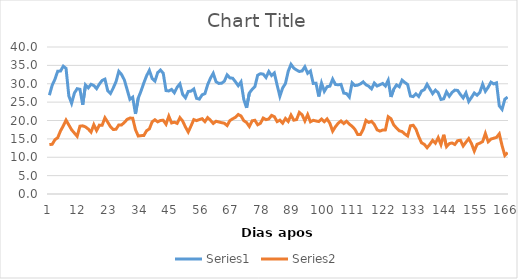
| Category | Series 0 | Series 1 |
|---|---|---|
| 0 | 26.88 | 13.46 |
| 1 | 29.59 | 13.52 |
| 2 | 31.21 | 14.77 |
| 3 | 33.43 | 15.32 |
| 4 | 33.44 | 17.16 |
| 5 | 34.78 | 18.52 |
| 6 | 34.18 | 20.11 |
| 7 | 26.69 | 18.78 |
| 8 | 24.68 | 17.48 |
| 9 | 27.46 | 16.58 |
| 10 | 28.66 | 15.7 |
| 11 | 28.49 | 18.45 |
| 12 | 24.28 | 18.55 |
| 13 | 29.68 | 18.26 |
| 14 | 28.88 | 17.67 |
| 15 | 29.86 | 16.84 |
| 16 | 29.51 | 18.86 |
| 17 | 28.67 | 17.26 |
| 18 | 29.92 | 18.74 |
| 19 | 30.9 | 18.72 |
| 20 | 31.25 | 20.74 |
| 21 | 28.13 | 19.55 |
| 22 | 27.34 | 18.31 |
| 23 | 28.85 | 17.54 |
| 24 | 30.58 | 17.63 |
| 25 | 33.38 | 18.8 |
| 26 | 32.51 | 18.8 |
| 27 | 31.03 | 19.46 |
| 28 | 28.4 | 20.31 |
| 29 | 25.76 | 20.66 |
| 30 | 26.34 | 20.63 |
| 31 | 21.79 | 17.49 |
| 32 | 26.1 | 15.77 |
| 33 | 28.01 | 15.88 |
| 34 | 30.2 | 15.9 |
| 35 | 32.17 | 17.22 |
| 36 | 33.64 | 17.71 |
| 37 | 31.42 | 19.64 |
| 38 | 30.73 | 20.21 |
| 39 | 33.02 | 19.64 |
| 40 | 33.73 | 20.03 |
| 41 | 32.85 | 20.04 |
| 42 | 28.14 | 18.98 |
| 43 | 28.04 | 21.18 |
| 44 | 28.45 | 19.33 |
| 45 | 27.55 | 19.54 |
| 46 | 29.05 | 19.22 |
| 47 | 29.97 | 20.77 |
| 48 | 27.1 | 19.84 |
| 49 | 26.19 | 18.22 |
| 50 | 27.91 | 16.87 |
| 51 | 27.99 | 18.52 |
| 52 | 28.57 | 20.25 |
| 53 | 26.03 | 19.97 |
| 54 | 25.82 | 20.25 |
| 55 | 26.99 | 20.49 |
| 56 | 27.31 | 19.69 |
| 57 | 29.76 | 20.79 |
| 58 | 31.52 | 20.06 |
| 59 | 32.84 | 19.19 |
| 60 | 30.55 | 19.79 |
| 61 | 30.09 | 19.61 |
| 62 | 30.14 | 19.41 |
| 63 | 30.7 | 19.25 |
| 64 | 32.42 | 18.62 |
| 65 | 31.6 | 19.98 |
| 66 | 31.5 | 20.46 |
| 67 | 30.53 | 20.86 |
| 68 | 29.47 | 21.64 |
| 69 | 30.52 | 21.23 |
| 70 | 25.74 | 19.96 |
| 71 | 23.44 | 19.45 |
| 72 | 27.47 | 18.37 |
| 73 | 28.46 | 19.92 |
| 74 | 29.21 | 20.06 |
| 75 | 32.33 | 18.84 |
| 76 | 32.73 | 19.25 |
| 77 | 32.62 | 20.67 |
| 78 | 31.7 | 20.24 |
| 79 | 33.33 | 20.42 |
| 80 | 32.23 | 21.39 |
| 81 | 32.93 | 21.05 |
| 82 | 29.66 | 19.7 |
| 83 | 26.59 | 20.09 |
| 84 | 28.86 | 19.28 |
| 85 | 30.06 | 20.56 |
| 86 | 33.4 | 19.74 |
| 87 | 35.29 | 21.47 |
| 88 | 34.26 | 20.09 |
| 89 | 33.74 | 20.25 |
| 90 | 33.34 | 22.19 |
| 91 | 33.48 | 21.55 |
| 92 | 34.61 | 19.87 |
| 93 | 32.85 | 21.6 |
| 94 | 33.46 | 19.65 |
| 95 | 30.09 | 20.06 |
| 96 | 30.15 | 19.87 |
| 97 | 26.54 | 19.72 |
| 98 | 30.17 | 20.39 |
| 99 | 27.93 | 19.67 |
| 100 | 29.2 | 20.42 |
| 101 | 29.34 | 19.25 |
| 102 | 31.26 | 17.1 |
| 103 | 29.81 | 18.29 |
| 104 | 29.71 | 19.27 |
| 105 | 29.84 | 19.87 |
| 106 | 27.46 | 19.16 |
| 107 | 27.31 | 19.79 |
| 108 | 26.38 | 19.01 |
| 109 | 30.25 | 18.42 |
| 110 | 29.51 | 17.61 |
| 111 | 29.61 | 16.2 |
| 112 | 29.95 | 16.18 |
| 113 | 30.52 | 17.59 |
| 114 | 29.72 | 20.04 |
| 115 | 29.33 | 19.47 |
| 116 | 28.6 | 19.78 |
| 117 | 30.18 | 18.93 |
| 118 | 29.38 | 17.46 |
| 119 | 29.72 | 17.12 |
| 120 | 30.08 | 17.39 |
| 121 | 29.4 | 17.44 |
| 122 | 30.94 | 21.03 |
| 123 | 26.41 | 20.48 |
| 124 | 28.51 | 18.78 |
| 125 | 29.68 | 17.96 |
| 126 | 29.19 | 17.2 |
| 127 | 30.98 | 16.99 |
| 128 | 30.34 | 16.32 |
| 129 | 29.79 | 15.79 |
| 130 | 26.66 | 18.56 |
| 131 | 26.49 | 18.7 |
| 132 | 27.24 | 17.63 |
| 133 | 26.53 | 15.59 |
| 134 | 28 | 13.93 |
| 135 | 28.39 | 13.51 |
| 136 | 29.85 | 12.59 |
| 137 | 28.59 | 13.49 |
| 138 | 27.31 | 14.59 |
| 139 | 28.26 | 13.82 |
| 140 | 27.56 | 15.34 |
| 141 | 25.73 | 13.44 |
| 142 | 25.91 | 16.12 |
| 143 | 27.81 | 12.89 |
| 144 | 26.6 | 13.71 |
| 145 | 27.64 | 13.89 |
| 146 | 28.27 | 13.47 |
| 147 | 28.18 | 14.5 |
| 148 | 27.09 | 14.63 |
| 149 | 26.14 | 13.07 |
| 150 | 27.52 | 14.11 |
| 151 | 25.18 | 15.08 |
| 152 | 26.29 | 13.71 |
| 153 | 27.48 | 11.68 |
| 154 | 26.88 | 13.52 |
| 155 | 27.64 | 13.84 |
| 156 | 29.88 | 14.25 |
| 157 | 27.95 | 16.47 |
| 158 | 29.04 | 14.22 |
| 159 | 30.44 | 14.95 |
| 160 | 29.96 | 15.18 |
| 161 | 30.25 | 15.4 |
| 162 | 24 | 16.37 |
| 163 | 23.03 | 13.17 |
| 164 | 25.8 | 10.5 |
| 165 | 26.37 | 11.28 |